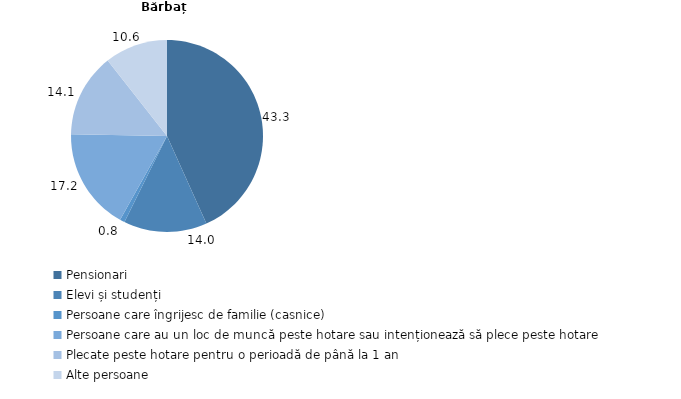
| Category | Bărbați |
|---|---|
| Pensionari | 43.271 |
| Elevi și studenți | 14.034 |
| Persoane care îngrijesc de familie (casnice) | 0.821 |
| Persoane care au un loc de muncă peste hotare sau intenționează să plece peste hotare | 17.166 |
| Plecate peste hotare pentru o perioadă de până la 1 an | 14.106 |
| Alte persoane | 10.601 |